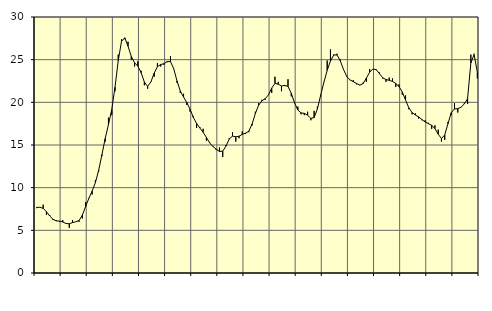
| Category | Piggar | Series 1 |
|---|---|---|
| nan | 7.6 | 7.68 |
| 87.0 | 7.7 | 7.7 |
| 87.0 | 8 | 7.57 |
| 87.0 | 6.8 | 7.19 |
| nan | 6.8 | 6.68 |
| 88.0 | 6.2 | 6.3 |
| 88.0 | 6.2 | 6.11 |
| 88.0 | 6 | 6.08 |
| nan | 6.2 | 5.98 |
| 89.0 | 5.8 | 5.8 |
| 89.0 | 5.3 | 5.77 |
| 89.0 | 6.2 | 5.91 |
| nan | 6 | 6 |
| 90.0 | 6 | 6.15 |
| 90.0 | 6.4 | 6.77 |
| 90.0 | 8.3 | 7.79 |
| nan | 8.8 | 8.75 |
| 91.0 | 9.2 | 9.59 |
| 91.0 | 10.9 | 10.6 |
| 91.0 | 11.9 | 12.04 |
| nan | 13.7 | 13.86 |
| 92.0 | 15.4 | 15.76 |
| 92.0 | 18.2 | 17.4 |
| 92.0 | 18.5 | 19.14 |
| nan | 21.3 | 21.76 |
| 93.0 | 25.6 | 24.9 |
| 93.0 | 27.4 | 27.14 |
| 93.0 | 27.4 | 27.56 |
| nan | 27.1 | 26.58 |
| 94.0 | 25 | 25.37 |
| 94.0 | 24.2 | 24.63 |
| 94.0 | 24.8 | 24.25 |
| nan | 23.7 | 23.47 |
| 95.0 | 22 | 22.38 |
| 95.0 | 21.6 | 21.87 |
| 95.0 | 22.4 | 22.39 |
| nan | 23 | 23.42 |
| 96.0 | 24.6 | 24.18 |
| 96.0 | 24.2 | 24.43 |
| 96.0 | 24.4 | 24.53 |
| nan | 24.7 | 24.78 |
| 97.0 | 25.4 | 24.78 |
| 97.0 | 23.9 | 23.93 |
| 97.0 | 22.3 | 22.51 |
| nan | 21.1 | 21.34 |
| 98.0 | 21 | 20.62 |
| 98.0 | 19.7 | 19.98 |
| 98.0 | 18.9 | 19.19 |
| nan | 18.4 | 18.23 |
| 99.0 | 17 | 17.52 |
| 99.0 | 17.1 | 16.99 |
| 99.0 | 16.9 | 16.49 |
| nan | 15.5 | 15.89 |
| 0.0 | 15.3 | 15.24 |
| 0.0 | 14.9 | 14.83 |
| 0.0 | 14.4 | 14.52 |
| nan | 14.7 | 14.24 |
| 1.0 | 13.6 | 14.28 |
| 1.0 | 15 | 14.87 |
| 1.0 | 15.8 | 15.7 |
| nan | 16.5 | 16.04 |
| 2.0 | 15.4 | 15.96 |
| 2.0 | 15.8 | 16.03 |
| 2.0 | 16.6 | 16.25 |
| nan | 16.3 | 16.39 |
| 3.0 | 16.5 | 16.62 |
| 3.0 | 17.3 | 17.45 |
| 3.0 | 18.9 | 18.7 |
| nan | 19.9 | 19.67 |
| 4.0 | 20.3 | 20.17 |
| 4.0 | 20.3 | 20.43 |
| 4.0 | 20.9 | 20.86 |
| nan | 21.1 | 21.67 |
| 5.0 | 23 | 22.22 |
| 5.0 | 22.4 | 22.12 |
| 5.0 | 21.3 | 21.92 |
| nan | 21.9 | 21.98 |
| 6.0 | 22.7 | 21.86 |
| 6.0 | 20.7 | 21.06 |
| 6.0 | 19.9 | 19.94 |
| nan | 19.5 | 19.1 |
| 7.0 | 18.6 | 18.76 |
| 7.0 | 18.5 | 18.71 |
| 7.0 | 18.9 | 18.49 |
| nan | 17.9 | 18.12 |
| 8.0 | 19 | 18.21 |
| 8.0 | 19.5 | 19.23 |
| 8.0 | 20.7 | 20.83 |
| nan | 22.4 | 22.37 |
| 9.0 | 24.9 | 23.75 |
| 9.0 | 26.2 | 24.84 |
| 9.0 | 25.6 | 25.54 |
| nan | 25.7 | 25.56 |
| 10.0 | 25 | 24.88 |
| 10.0 | 23.9 | 23.85 |
| 10.0 | 23.1 | 23.03 |
| nan | 22.6 | 22.62 |
| 11.0 | 22.6 | 22.42 |
| 11.0 | 22.1 | 22.21 |
| 11.0 | 22 | 22.02 |
| nan | 22.3 | 22.2 |
| 12.0 | 22.4 | 22.84 |
| 12.0 | 23.9 | 23.53 |
| 12.0 | 23.9 | 23.9 |
| nan | 23.9 | 23.83 |
| 13.0 | 23.5 | 23.37 |
| 13.0 | 22.8 | 22.88 |
| 13.0 | 22.4 | 22.67 |
| nan | 22.9 | 22.58 |
| 14.0 | 22.8 | 22.45 |
| 14.0 | 21.8 | 22.21 |
| 14.0 | 22.1 | 21.85 |
| nan | 20.9 | 21.22 |
| 15.0 | 20.8 | 20.27 |
| 15.0 | 19.2 | 19.36 |
| 15.0 | 18.6 | 18.8 |
| nan | 18.7 | 18.52 |
| 16.0 | 18.1 | 18.3 |
| 16.0 | 17.9 | 17.99 |
| 16.0 | 17.9 | 17.7 |
| nan | 17.6 | 17.51 |
| 17.0 | 16.9 | 17.3 |
| 17.0 | 17.3 | 16.93 |
| 17.0 | 16.8 | 16.27 |
| nan | 15.4 | 15.76 |
| 18.0 | 15.6 | 16.17 |
| 18.0 | 17.7 | 17.51 |
| 18.0 | 18.5 | 18.79 |
| nan | 19.9 | 19.23 |
| 19.0 | 18.8 | 19.26 |
| 19.0 | 19.4 | 19.42 |
| 19.0 | 19.9 | 19.82 |
| nan | 19.8 | 20.42 |
| 20.0 | 25.6 | 24.61 |
| 20.0 | 25.7 | 25.61 |
| 20.0 | 22.8 | 23.52 |